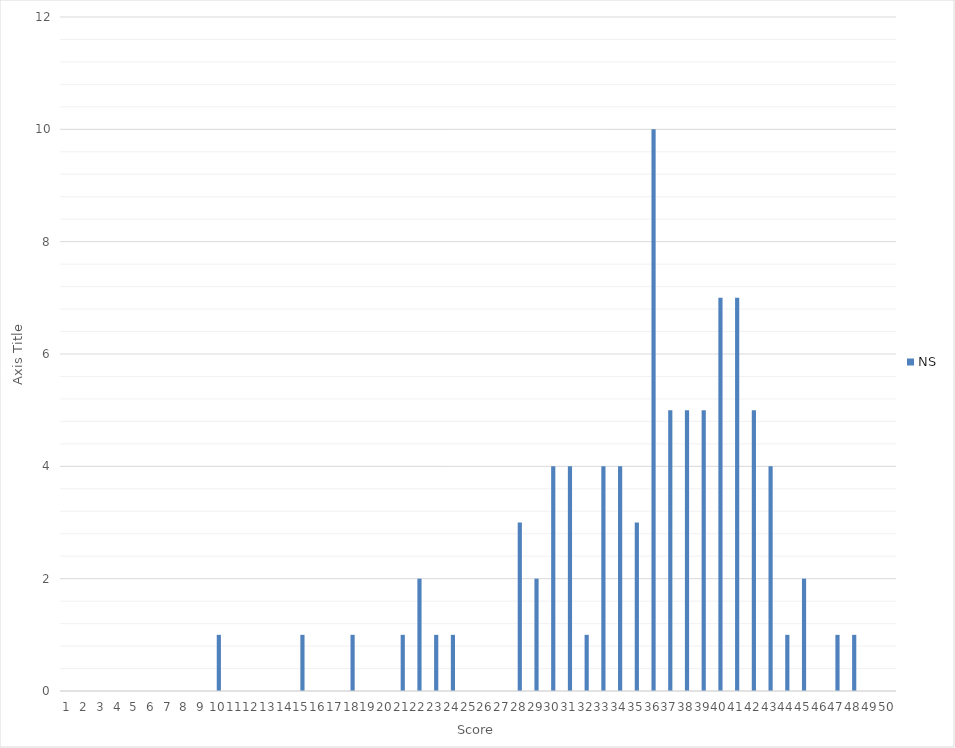
| Category | NS |
|---|---|
| 0 | 0 |
| 1 | 0 |
| 2 | 0 |
| 3 | 0 |
| 4 | 0 |
| 5 | 0 |
| 6 | 0 |
| 7 | 0 |
| 8 | 0 |
| 9 | 1 |
| 10 | 0 |
| 11 | 0 |
| 12 | 0 |
| 13 | 0 |
| 14 | 1 |
| 15 | 0 |
| 16 | 0 |
| 17 | 1 |
| 18 | 0 |
| 19 | 0 |
| 20 | 1 |
| 21 | 2 |
| 22 | 1 |
| 23 | 1 |
| 24 | 0 |
| 25 | 0 |
| 26 | 0 |
| 27 | 3 |
| 28 | 2 |
| 29 | 4 |
| 30 | 4 |
| 31 | 1 |
| 32 | 4 |
| 33 | 4 |
| 34 | 3 |
| 35 | 10 |
| 36 | 5 |
| 37 | 5 |
| 38 | 5 |
| 39 | 7 |
| 40 | 7 |
| 41 | 5 |
| 42 | 4 |
| 43 | 1 |
| 44 | 2 |
| 45 | 0 |
| 46 | 1 |
| 47 | 1 |
| 48 | 0 |
| 49 | 0 |